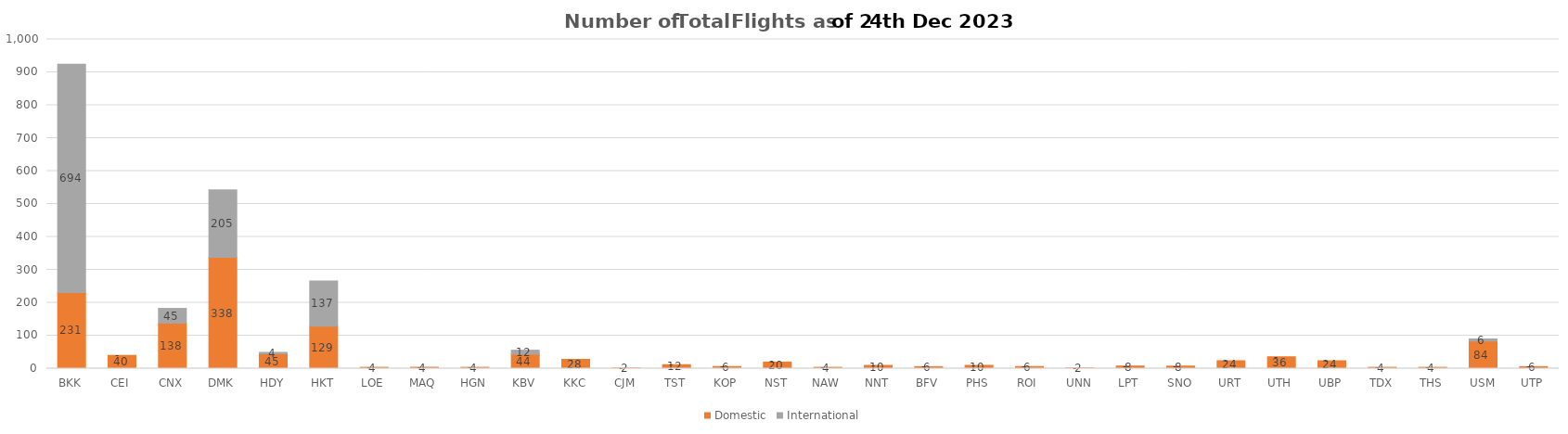
| Category | Domestic | International |
|---|---|---|
| BKK | 231 | 694 |
| CEI | 40 | 0 |
| CNX | 138 | 45 |
| DMK | 338 | 205 |
| HDY | 45 | 4 |
| HKT | 129 | 137 |
| LOE | 4 | 0 |
| MAQ | 4 | 0 |
| HGN | 4 | 0 |
| KBV | 44 | 12 |
| KKC | 28 | 0 |
| CJM | 2 | 0 |
| TST | 12 | 0 |
| KOP | 6 | 0 |
| NST | 20 | 0 |
| NAW | 4 | 0 |
| NNT | 10 | 0 |
| BFV | 6 | 0 |
| PHS | 10 | 0 |
| ROI | 6 | 0 |
| UNN | 2 | 0 |
| LPT | 8 | 0 |
| SNO | 8 | 0 |
| URT | 24 | 0 |
| UTH | 36 | 0 |
| UBP | 24 | 0 |
| TDX | 4 | 0 |
| THS | 4 | 0 |
| USM | 84 | 6 |
| UTP | 6 | 0 |